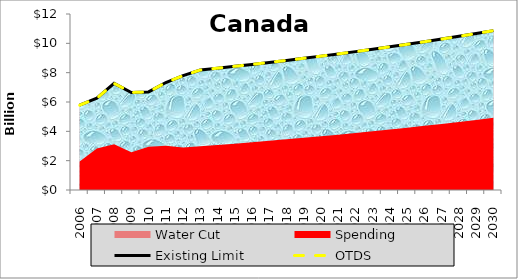
| Category | Existing Limit | OTDS |
|---|---|---|
| 0 | 5782343191.102 | 5782343191.102 |
| 1 | 6260005191.102 | 6260005191.102 |
| 2 | 7268794191.102 | 7268794191.102 |
| 3 | 6649163191.102 | 6649163191.102 |
| 4 | 6687609191.102 | 6687609191.102 |
| 5 | 7326502191.102 | 7326502191.102 |
| 6 | 7798103191.102 | 7798103191.102 |
| 7 | 8182085191.102 | 8182085191.102 |
| 8 | 8305422031.102 | 8305422031.102 |
| 9 | 8432458976.302 | 8432458976.302 |
| 10 | 8563307029.858 | 8563307029.858 |
| 11 | 8698080525.02 | 8698080525.02 |
| 12 | 8836897225.038 | 8836897225.038 |
| 13 | 8979878426.056 | 8979878426.056 |
| 14 | 9127149063.105 | 9127149063.105 |
| 15 | 9278837819.265 | 9278837819.265 |
| 16 | 9435077238.11 | 9435077238.11 |
| 17 | 9596003839.52 | 9596003839.52 |
| 18 | 9761758238.973 | 9761758238.973 |
| 19 | 9932485270.409 | 9932485270.409 |
| 20 | 10108334112.788 | 10108334112.788 |
| 21 | 10289458420.438 | 10289458420.438 |
| 22 | 10476016457.319 | 10476016457.319 |
| 23 | 10668171235.305 | 10668171235.305 |
| 24 | 10866090656.631 | 10866090656.631 |